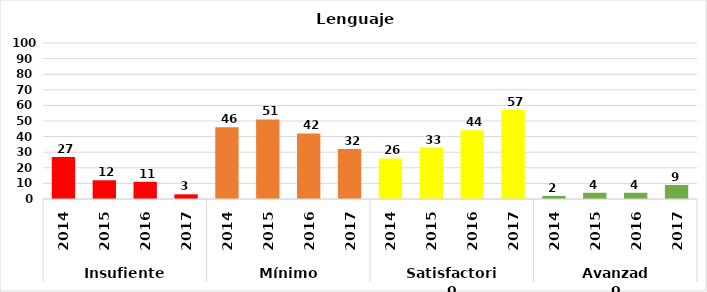
| Category | Series 0 |
|---|---|
| 0 | 27 |
| 1 | 12 |
| 2 | 11 |
| 3 | 3 |
| 4 | 46 |
| 5 | 51 |
| 6 | 42 |
| 7 | 32 |
| 8 | 26 |
| 9 | 33 |
| 10 | 44 |
| 11 | 57 |
| 12 | 2 |
| 13 | 4 |
| 14 | 4 |
| 15 | 9 |